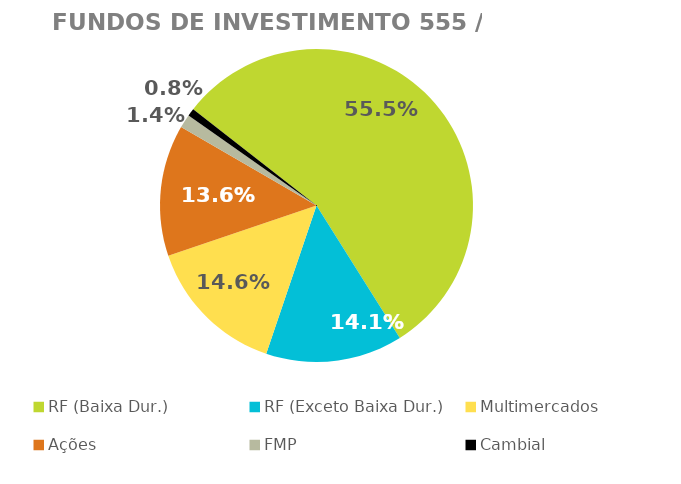
| Category | Fundos de Investimento 555 / FMP |
|---|---|
| RF (Baixa Dur.) | 0.555 |
| RF (Exceto Baixa Dur.) | 0.141 |
| Multimercados | 0.146 |
| Ações | 0.136 |
| FMP | 0.014 |
| Cambial | 0.008 |